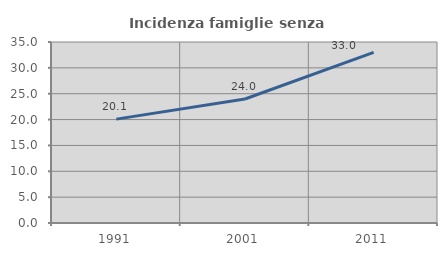
| Category | Incidenza famiglie senza nuclei |
|---|---|
| 1991.0 | 20.088 |
| 2001.0 | 23.974 |
| 2011.0 | 32.988 |